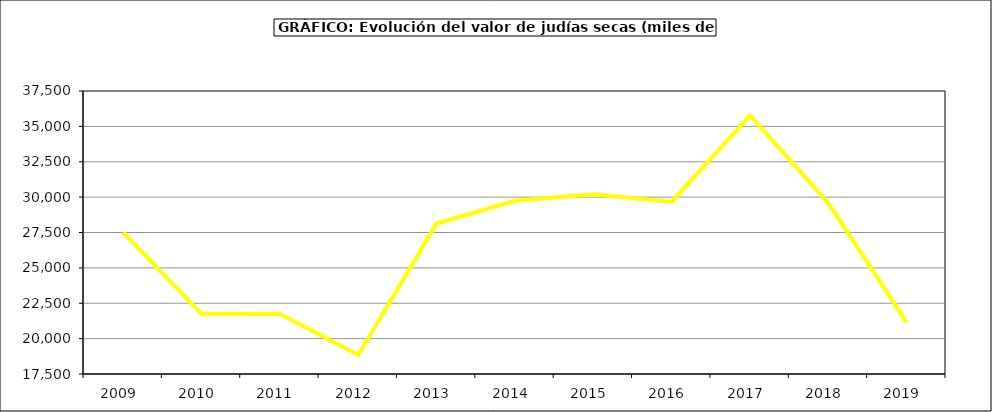
| Category | Valor |
|---|---|
| 2009.0 | 27515.988 |
| 2010.0 | 21751.277 |
| 2011.0 | 21735.778 |
| 2012.0 | 18845.19 |
| 2013.0 | 28136.167 |
| 2014.0 | 29742.558 |
| 2015.0 | 30200 |
| 2016.0 | 29661 |
| 2017.0 | 35775.053 |
| 2018.0 | 29574.266 |
| 2019.0 | 21144.982 |